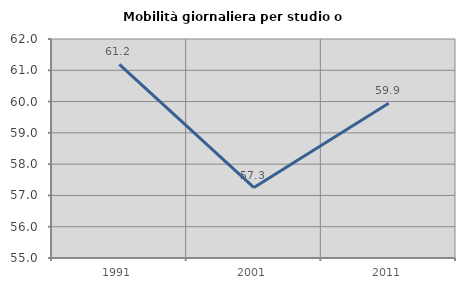
| Category | Mobilità giornaliera per studio o lavoro |
|---|---|
| 1991.0 | 61.187 |
| 2001.0 | 57.253 |
| 2011.0 | 59.947 |